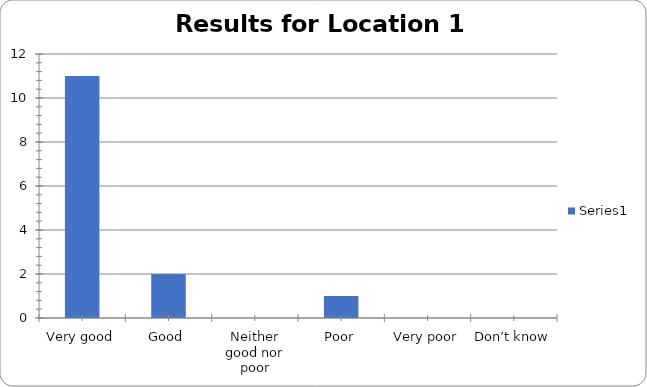
| Category | Series 0 |
|---|---|
| Very good | 11 |
| Good | 2 |
| Neither good nor poor | 0 |
| Poor | 1 |
| Very poor | 0 |
| Don’t know | 0 |